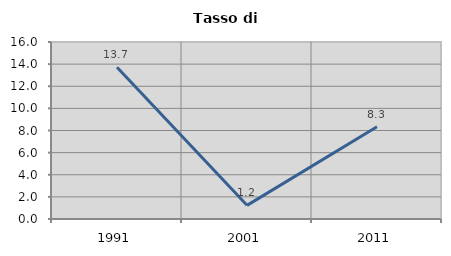
| Category | Tasso di disoccupazione   |
|---|---|
| 1991.0 | 13.714 |
| 2001.0 | 1.235 |
| 2011.0 | 8.333 |